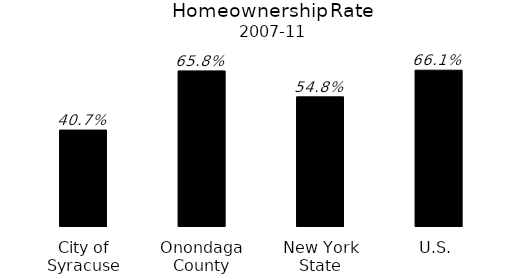
| Category | Series 0 |
|---|---|
| City of Syracuse | 0.407 |
| Onondaga County | 0.658 |
| New York State | 0.548 |
| U.S. | 0.661 |